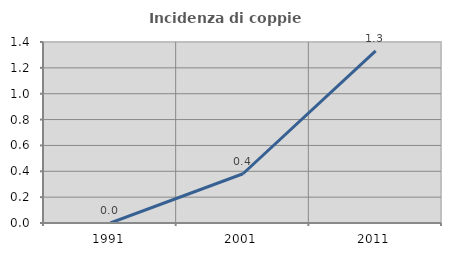
| Category | Incidenza di coppie miste |
|---|---|
| 1991.0 | 0 |
| 2001.0 | 0.381 |
| 2011.0 | 1.331 |